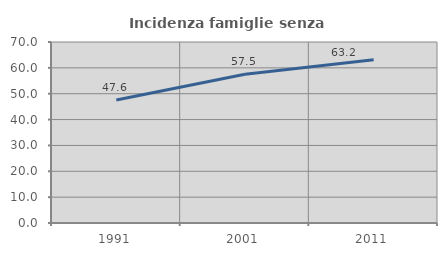
| Category | Incidenza famiglie senza nuclei |
|---|---|
| 1991.0 | 47.566 |
| 2001.0 | 57.536 |
| 2011.0 | 63.175 |